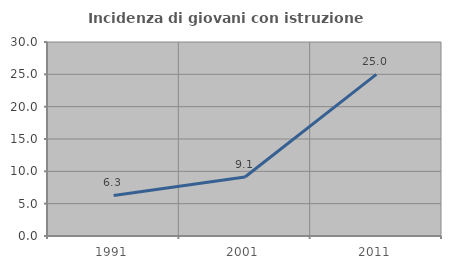
| Category | Incidenza di giovani con istruzione universitaria |
|---|---|
| 1991.0 | 6.27 |
| 2001.0 | 9.129 |
| 2011.0 | 25 |